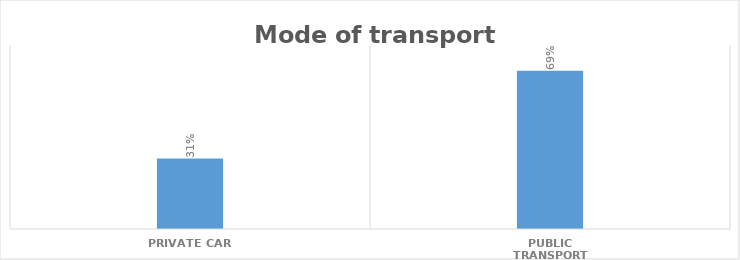
| Category | Series 0 |
|---|---|
| PRIVATE CAR | 0.308 |
| PUBLIC TRANSPORT | 0.692 |